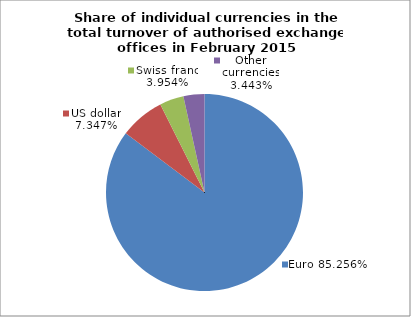
| Category | EUR |
|---|---|
| 0 | 0.853 |
| 1 | 0.073 |
| 2 | 0.04 |
| 3 | 0.034 |